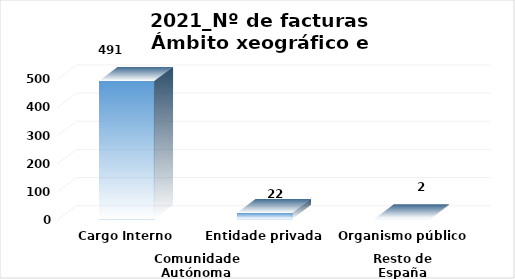
| Category | Series 0 |
|---|---|
| 0 | 491 |
| 1 | 22 |
| 2 | 2 |